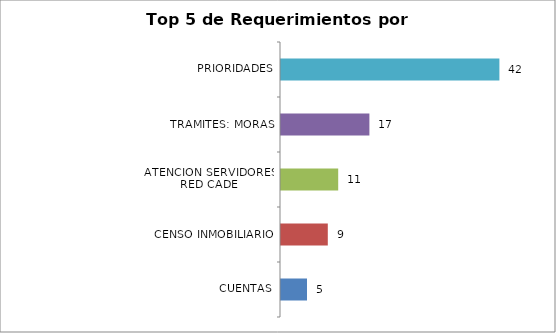
| Category | Total |
|---|---|
| CUENTAS | 5 |
| CENSO INMOBILIARIO | 9 |
| ATENCION SERVIDORES RED CADE | 11 |
| TRAMITES: MORAS, PRIORIDADES | 17 |
| ATENCION Y SERVICIO A LA CIUDADANIA | 42 |